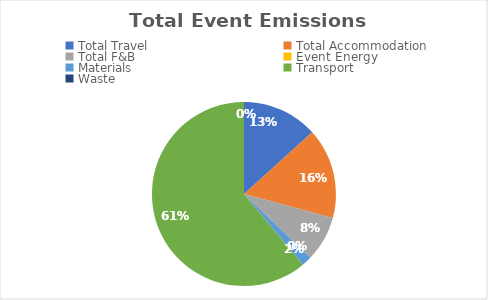
| Category | Series 0 |
|---|---|
| Total Travel | 0.15 |
| Total Accommodation | 0.18 |
| Total F&B | 0.09 |
| Event Energy | 0 |
| Materials | 0.02 |
| Transport | 0.69 |
| Waste | 0 |